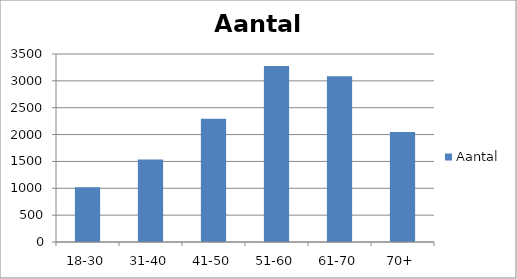
| Category | Aantal |
|---|---|
| 18-30 | 1021 |
| 31-40 | 1537 |
| 41-50 | 2293 |
| 51-60 | 3276 |
| 61-70 | 3087 |
| 70+ | 2048 |